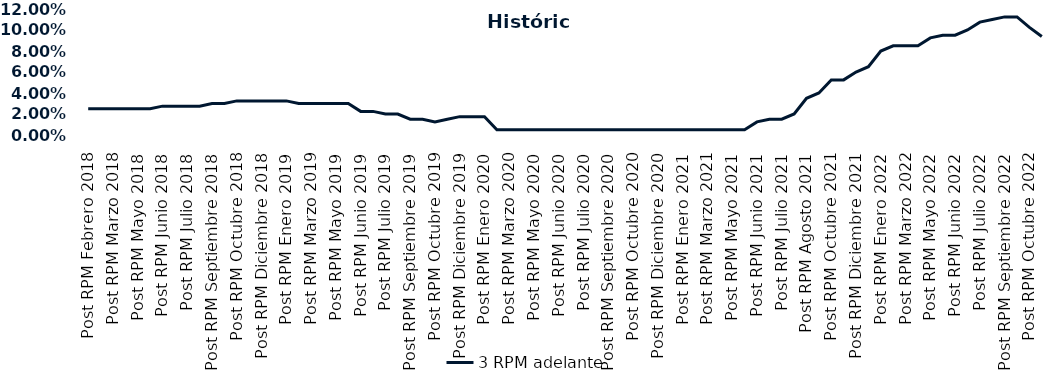
| Category | 3 RPM adelante |
|---|---|
| Post RPM Febrero 2018 | 0.025 |
| Pre RPM Marzo 2018 | 0.025 |
| Post RPM Marzo 2018 | 0.025 |
| Pre RPM Mayo 2018 | 0.025 |
| Post RPM Mayo 2018 | 0.025 |
| Pre RPM Junio 2018 | 0.025 |
| Post RPM Junio 2018 | 0.028 |
| Pre RPM Julio 2018 | 0.028 |
| Post RPM Julio 2018 | 0.028 |
| Pre RPM Septiembre 2018 | 0.028 |
| Post RPM Septiembre 2018 | 0.03 |
| Pre RPM Octubre 2018 | 0.03 |
| Post RPM Octubre 2018 | 0.032 |
| Pre RPM Diciembre 2018 | 0.032 |
| Post RPM Diciembre 2018 | 0.032 |
| Pre RPM Enero 2019 | 0.032 |
| Post RPM Enero 2019 | 0.032 |
| Pre RPM Marzo 2019 | 0.03 |
| Post RPM Marzo 2019 | 0.03 |
| Pre RPM Mayo 2019 | 0.03 |
| Post RPM Mayo 2019 | 0.03 |
| Pre RPM Junio 2019 | 0.03 |
| Post RPM Junio 2019 | 0.022 |
| Pre RPM Julio 2019 | 0.022 |
| Post RPM Julio 2019 | 0.02 |
| Pre RPM Septiembre 2019 | 0.02 |
| Post RPM Septiembre 2019 | 0.015 |
| Pre RPM Octubre 2019 | 0.015 |
| Post RPM Octubre 2019 | 0.012 |
| Pre RPM Diciembre 2019 | 0.015 |
| Post RPM Diciembre 2019 | 0.018 |
| Pre RPM Enero 2020 | 0.018 |
| Post RPM Enero 2020 | 0.018 |
| Pre RPM Marzo 2020 | 0.005 |
| Post RPM Marzo 2020 | 0.005 |
| Pre RPM Mayo 2020 | 0.005 |
| Post RPM Mayo 2020 | 0.005 |
| Pre RPM Junio 2020 | 0.005 |
| Post RPM Junio 2020 | 0.005 |
| Pre RPM Julio 2020 | 0.005 |
| Post RPM Julio 2020 | 0.005 |
| Pre RPM Septiembre 2020 | 0.005 |
| Post RPM Septiembre 2020 | 0.005 |
| Pre RPM Octubre 2020 | 0.005 |
| Post RPM Octubre 2020 | 0.005 |
| Pre RPM Diciembre 2020 | 0.005 |
| Post RPM Diciembre 2020 | 0.005 |
| Pre RPM Enero 2021 | 0.005 |
| Post RPM Enero 2021 | 0.005 |
| Pre RPM Marzo 2021 | 0.005 |
| Post RPM Marzo 2021 | 0.005 |
| Pre RPM Mayo 2021 | 0.005 |
| Post RPM Mayo 2021 | 0.005 |
| Pre RPM Junio 2021 | 0.005 |
| Post RPM Junio 2021 | 0.012 |
| Pre RPM Julio 2021 | 0.015 |
| Post RPM Julio 2021 | 0.015 |
| Pre RPM Agosto 2021 | 0.02 |
| Post RPM Agosto 2021 | 0.035 |
| Pre RPM Octubre 2021 | 0.04 |
| Post RPM Octubre 2021 | 0.052 |
| Pre RPM Diciembre 2021 | 0.052 |
| Post RPM Diciembre 2021 | 0.06 |
| Pre RPM Enero 2022 | 0.065 |
| Post RPM Enero 2022 | 0.08 |
| Pre RPM Marzo 2022 | 0.085 |
| Post RPM Marzo 2022 | 0.085 |
| Pre RPM Mayo 2022 | 0.085 |
| Post RPM Mayo 2022 | 0.092 |
| Pre RPM Junio 2022 | 0.095 |
| Post RPM Junio 2022 | 0.095 |
| Pre RPM Julio 2022 | 0.1 |
| Post RPM Julio 2022 | 0.108 |
| Pre RPM Septiembre 2022 | 0.11 |
| Post RPM Septiembre 2022 | 0.112 |
| Pre RPM Octubre 2022 | 0.112 |
| Post RPM Octubre 2022 | 0.102 |
| Pre RPM Diciembre 2022 | 0.094 |